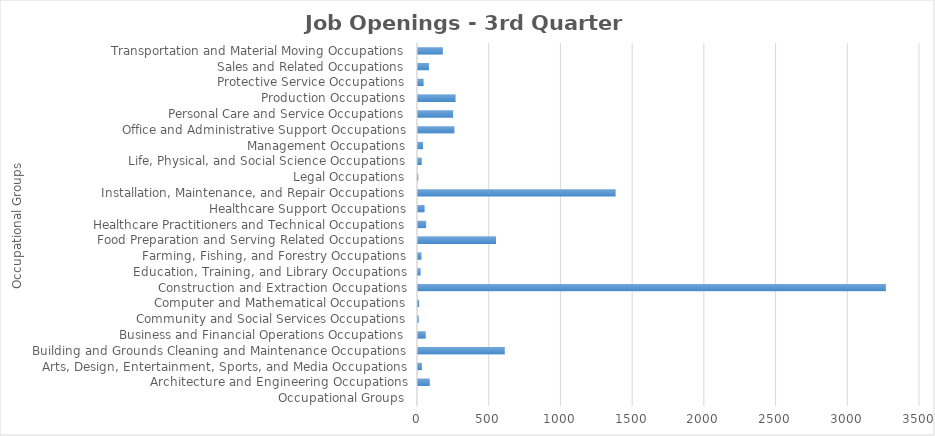
| Category | Series1 |
|---|---|
| Occupational Groups | 0 |
| Architecture and Engineering Occupations | 82 |
| Arts, Design, Entertainment, Sports, and Media Occupations | 27 |
| Building and Grounds Cleaning and Maintenance Occupations | 605 |
| Business and Financial Operations Occupations | 54 |
| Community and Social Services Occupations | 5 |
| Computer and Mathematical Occupations | 8 |
| Construction and Extraction Occupations | 3262 |
| Education, Training, and Library Occupations | 18 |
| Farming, Fishing, and Forestry Occupations | 24 |
| Food Preparation and Serving Related Occupations | 544 |
| Healthcare Practitioners and Technical Occupations | 57 |
| Healthcare Support Occupations | 46 |
| Installation, Maintenance, and Repair Occupations | 1378 |
| Legal Occupations | 2 |
| Life, Physical, and Social Science Occupations | 26 |
| Management Occupations | 35 |
| Office and Administrative Support Occupations | 254 |
| Personal Care and Service Occupations | 245 |
| Production Occupations | 262 |
| Protective Service Occupations | 39 |
| Sales and Related Occupations | 76 |
| Transportation and Material Moving Occupations | 173 |